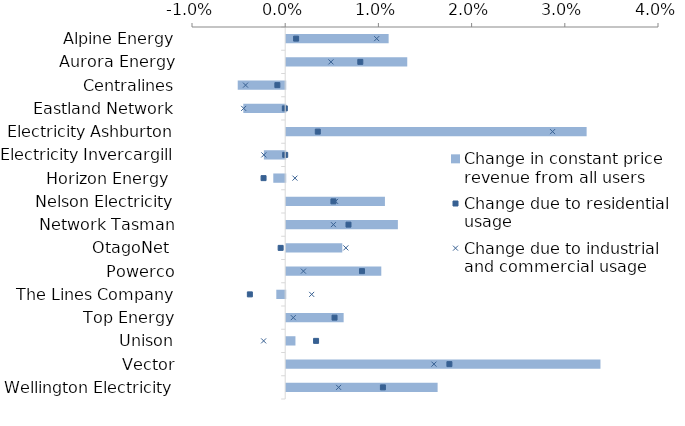
| Category | Change in constant price revenue from all users |
|---|---|
| Alpine Energy | 0.011 |
| Aurora Energy | 0.013 |
| Centralines | -0.005 |
| Eastland Network | -0.004 |
| Electricity Ashburton | 0.032 |
| Electricity Invercargill | -0.002 |
| Horizon Energy  | -0.001 |
| Nelson Electricity | 0.011 |
| Network Tasman | 0.012 |
| OtagoNet  | 0.006 |
| Powerco | 0.01 |
| The Lines Company | -0.001 |
| Top Energy | 0.006 |
| Unison | 0.001 |
| Vector | 0.034 |
| Wellington Electricity | 0.016 |